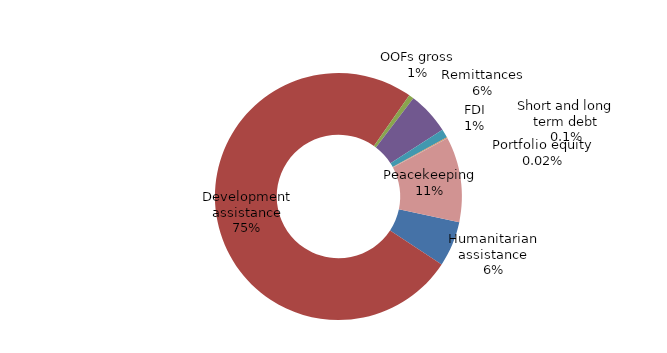
| Category | Series 0 |
|---|---|
| Humanitarian assistance | 0.492 |
| Development assistance | 6.253 |
| OOFs gross | 0.054 |
| Remittances | 0.46 |
| FDI | 0.094 |
| Short and long term debt | 0.009 |
| Portfolio equity | 0.002 |
| Peacekeeping | 0.924 |